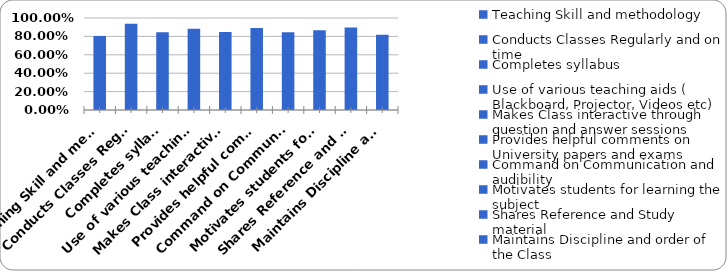
| Category | Series 0 |
|---|---|
| Teaching Skill and methodology | 0.804 |
| Conducts Classes Regularly and on time | 0.936 |
| Completes syllabus | 0.846 |
| Use of various teaching aids ( Blackboard, Projector, Videos etc) | 0.882 |
| Makes Class interactive through question and answer sessions | 0.848 |
| Provides helpful comments on University papers and exams | 0.892 |
| Command on Communication and audibility  | 0.846 |
| Motivates students for learning the subject | 0.868 |
| Shares Reference and Study material  | 0.897 |
| Maintains Discipline and order of the Class | 0.819 |